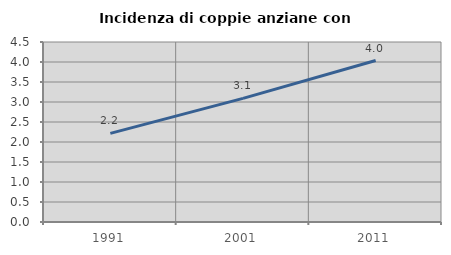
| Category | Incidenza di coppie anziane con figli |
|---|---|
| 1991.0 | 2.216 |
| 2001.0 | 3.09 |
| 2011.0 | 4.036 |